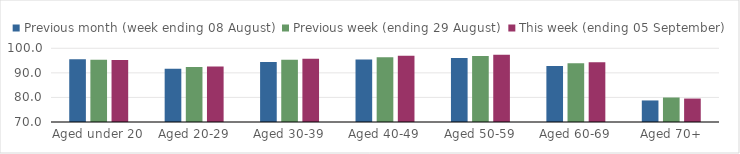
| Category | Previous month (week ending 08 August) | Previous week (ending 29 August) | This week (ending 05 September) |
|---|---|---|---|
| Aged under 20 | 95.54 | 95.32 | 95.2 |
| Aged 20-29 | 91.66 | 92.4 | 92.54 |
| Aged 30-39 | 94.43 | 95.34 | 95.7 |
| Aged 40-49 | 95.42 | 96.33 | 96.92 |
| Aged 50-59 | 96 | 96.85 | 97.35 |
| Aged 60-69 | 92.76 | 93.91 | 94.27 |
| Aged 70+ | 78.77 | 79.97 | 79.54 |